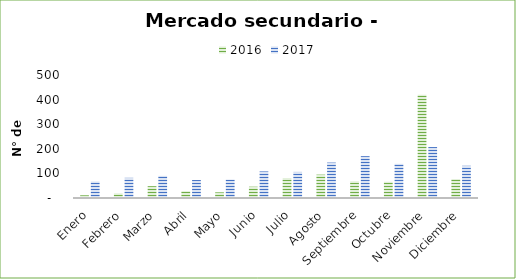
| Category | 2016 | 2017 |
|---|---|---|
| Enero | 11 | 67 |
| Febrero | 19 | 82 |
| Marzo | 48 | 90 |
| Abril | 28 | 73 |
| Mayo | 23 | 75 |
| Junio | 46 | 108 |
| Julio | 81 | 106 |
| Agosto | 95 | 144 |
| Septiembre | 68 | 170 |
| Octubre | 66 | 139 |
| Noviembre | 420 | 207 |
| Diciembre | 77 | 131 |